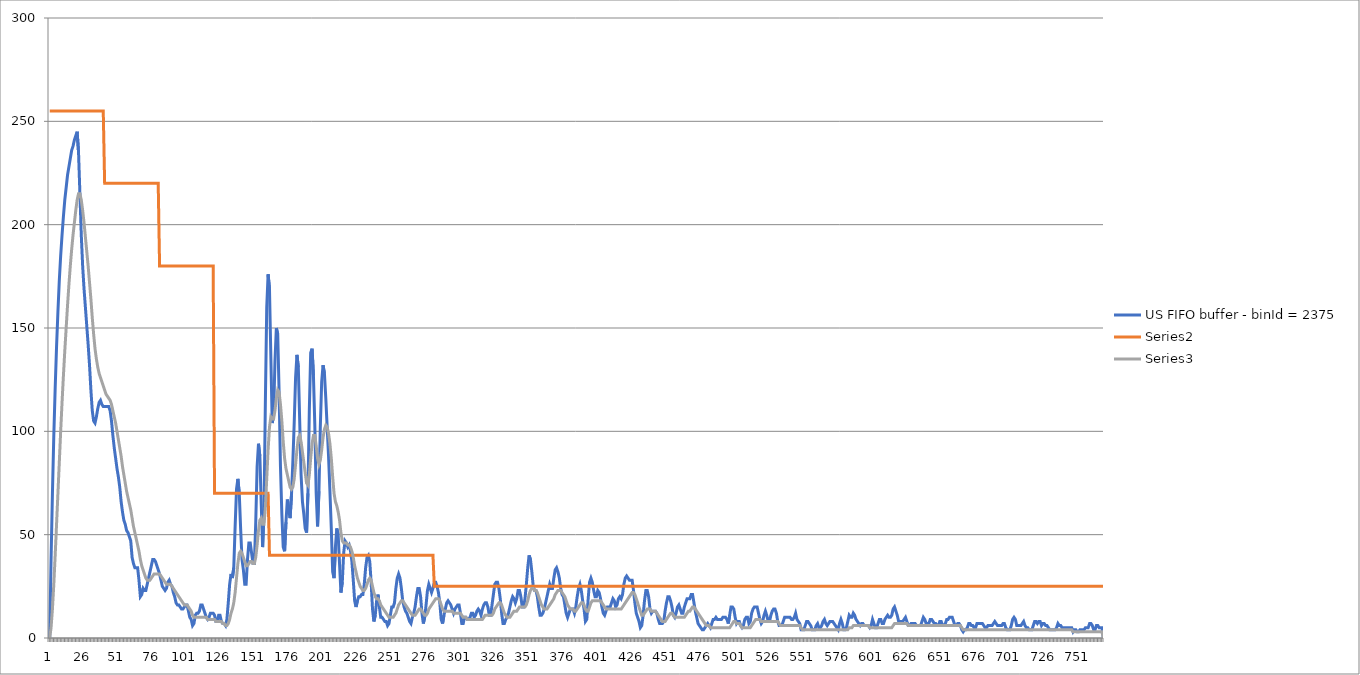
| Category | US FIFO buffer - binId = 2375 | Series 1 | Series 2 |
|---|---|---|---|
| 0 | 0 | 255 | 0 |
| 1 | 38 | 255 | 5 |
| 2 | 70 | 255 | 14 |
| 3 | 98 | 255 | 26 |
| 4 | 121 | 255 | 40 |
| 5 | 141 | 255 | 55 |
| 6 | 158 | 255 | 70 |
| 7 | 173 | 255 | 85 |
| 8 | 185 | 255 | 100 |
| 9 | 195 | 255 | 114 |
| 10 | 204 | 255 | 127 |
| 11 | 212 | 255 | 139 |
| 12 | 218 | 255 | 150 |
| 13 | 224 | 255 | 161 |
| 14 | 228 | 255 | 171 |
| 15 | 232 | 255 | 180 |
| 16 | 236 | 255 | 188 |
| 17 | 238 | 255 | 195 |
| 18 | 241 | 255 | 201 |
| 19 | 243 | 255 | 207 |
| 20 | 245 | 255 | 212 |
| 21 | 235 | 255 | 215 |
| 22 | 215 | 255 | 215 |
| 23 | 195 | 255 | 212 |
| 24 | 180 | 255 | 207 |
| 25 | 169 | 255 | 201 |
| 26 | 160 | 255 | 194 |
| 27 | 151 | 255 | 187 |
| 28 | 142 | 255 | 180 |
| 29 | 132 | 255 | 172 |
| 30 | 120 | 255 | 164 |
| 31 | 110 | 255 | 155 |
| 32 | 105 | 255 | 147 |
| 33 | 104 | 255 | 140 |
| 34 | 107 | 255 | 135 |
| 35 | 111 | 255 | 131 |
| 36 | 114 | 255 | 128 |
| 37 | 115 | 255 | 126 |
| 38 | 113 | 255 | 124 |
| 39 | 112 | 255 | 122 |
| 40 | 112 | 220 | 120 |
| 41 | 112 | 220 | 118 |
| 42 | 112 | 220 | 117 |
| 43 | 112 | 220 | 116 |
| 44 | 110 | 220 | 115 |
| 45 | 105 | 220 | 113 |
| 46 | 98 | 220 | 110 |
| 47 | 92 | 220 | 107 |
| 48 | 87 | 220 | 104 |
| 49 | 82 | 220 | 100 |
| 50 | 78 | 220 | 96 |
| 51 | 73 | 220 | 92 |
| 52 | 66 | 220 | 88 |
| 53 | 61 | 220 | 83 |
| 54 | 57 | 220 | 79 |
| 55 | 55 | 220 | 75 |
| 56 | 52 | 220 | 71 |
| 57 | 51 | 220 | 68 |
| 58 | 49 | 220 | 65 |
| 59 | 47 | 220 | 62 |
| 60 | 39 | 220 | 58 |
| 61 | 36 | 220 | 54 |
| 62 | 34 | 220 | 51 |
| 63 | 34 | 220 | 48 |
| 64 | 34 | 220 | 45 |
| 65 | 28 | 220 | 42 |
| 66 | 20 | 220 | 38 |
| 67 | 21 | 220 | 35 |
| 68 | 24 | 220 | 33 |
| 69 | 23 | 220 | 31 |
| 70 | 23 | 220 | 29 |
| 71 | 26 | 220 | 28 |
| 72 | 29 | 220 | 28 |
| 73 | 32 | 220 | 28 |
| 74 | 35 | 220 | 29 |
| 75 | 38 | 220 | 30 |
| 76 | 38 | 220 | 31 |
| 77 | 37 | 220 | 31 |
| 78 | 35 | 220 | 31 |
| 79 | 33 | 220 | 31 |
| 80 | 31 | 180 | 31 |
| 81 | 28 | 180 | 30 |
| 82 | 25 | 180 | 29 |
| 83 | 24 | 180 | 28 |
| 84 | 23 | 180 | 27 |
| 85 | 24 | 180 | 26 |
| 86 | 27 | 180 | 26 |
| 87 | 28 | 180 | 26 |
| 88 | 26 | 180 | 26 |
| 89 | 25 | 180 | 25 |
| 90 | 22 | 180 | 24 |
| 91 | 20 | 180 | 23 |
| 92 | 17 | 180 | 22 |
| 93 | 16 | 180 | 21 |
| 94 | 16 | 180 | 20 |
| 95 | 15 | 180 | 19 |
| 96 | 14 | 180 | 18 |
| 97 | 14 | 180 | 17 |
| 98 | 15 | 180 | 16 |
| 99 | 16 | 180 | 16 |
| 100 | 16 | 180 | 16 |
| 101 | 13 | 180 | 15 |
| 102 | 10 | 180 | 14 |
| 103 | 9 | 180 | 13 |
| 104 | 6 | 180 | 11 |
| 105 | 7 | 180 | 10 |
| 106 | 11 | 180 | 10 |
| 107 | 12 | 180 | 10 |
| 108 | 12 | 180 | 10 |
| 109 | 13 | 180 | 10 |
| 110 | 16 | 180 | 10 |
| 111 | 16 | 180 | 10 |
| 112 | 14 | 180 | 10 |
| 113 | 12 | 180 | 10 |
| 114 | 10 | 180 | 10 |
| 115 | 9 | 180 | 9 |
| 116 | 10 | 180 | 9 |
| 117 | 12 | 180 | 9 |
| 118 | 12 | 180 | 9 |
| 119 | 12 | 180 | 9 |
| 120 | 11 | 70 | 9 |
| 121 | 8 | 70 | 8 |
| 122 | 8 | 70 | 8 |
| 123 | 11 | 70 | 8 |
| 124 | 11 | 70 | 8 |
| 125 | 8 | 70 | 8 |
| 126 | 7 | 70 | 7 |
| 127 | 7 | 70 | 7 |
| 128 | 6 | 70 | 6 |
| 129 | 9 | 70 | 6 |
| 130 | 17 | 70 | 7 |
| 131 | 26 | 70 | 9 |
| 132 | 31 | 70 | 12 |
| 133 | 29 | 70 | 14 |
| 134 | 34 | 70 | 17 |
| 135 | 54 | 70 | 22 |
| 136 | 72 | 70 | 29 |
| 137 | 77 | 70 | 36 |
| 138 | 70 | 70 | 41 |
| 139 | 53 | 70 | 42 |
| 140 | 38 | 70 | 41 |
| 141 | 33 | 70 | 39 |
| 142 | 26 | 70 | 37 |
| 143 | 26 | 70 | 35 |
| 144 | 38 | 70 | 35 |
| 145 | 46 | 70 | 36 |
| 146 | 46 | 70 | 37 |
| 147 | 41 | 70 | 37 |
| 148 | 36 | 70 | 36 |
| 149 | 36 | 70 | 36 |
| 150 | 56 | 70 | 39 |
| 151 | 83 | 70 | 45 |
| 152 | 94 | 70 | 52 |
| 153 | 88 | 70 | 57 |
| 154 | 65 | 70 | 58 |
| 155 | 44 | 70 | 55 |
| 156 | 61 | 70 | 55 |
| 157 | 114 | 70 | 63 |
| 158 | 160 | 70 | 77 |
| 159 | 176 | 70 | 91 |
| 160 | 169 | 40 | 102 |
| 161 | 136 | 40 | 107 |
| 162 | 104 | 40 | 106 |
| 163 | 108 | 40 | 106 |
| 164 | 134 | 40 | 110 |
| 165 | 150 | 40 | 116 |
| 166 | 147 | 40 | 120 |
| 167 | 119 | 40 | 119 |
| 168 | 83 | 40 | 113 |
| 169 | 60 | 40 | 105 |
| 170 | 44 | 40 | 95 |
| 171 | 42 | 40 | 87 |
| 172 | 56 | 40 | 82 |
| 173 | 67 | 40 | 79 |
| 174 | 62 | 40 | 76 |
| 175 | 58 | 40 | 73 |
| 176 | 69 | 40 | 72 |
| 177 | 85 | 40 | 73 |
| 178 | 104 | 40 | 77 |
| 179 | 126 | 40 | 84 |
| 180 | 137 | 40 | 91 |
| 181 | 131 | 40 | 97 |
| 182 | 105 | 40 | 98 |
| 183 | 79 | 40 | 95 |
| 184 | 66 | 40 | 90 |
| 185 | 60 | 40 | 85 |
| 186 | 53 | 40 | 80 |
| 187 | 51 | 40 | 75 |
| 188 | 70 | 40 | 74 |
| 189 | 110 | 40 | 79 |
| 190 | 138 | 40 | 87 |
| 191 | 140 | 40 | 94 |
| 192 | 127 | 40 | 98 |
| 193 | 103 | 40 | 98 |
| 194 | 70 | 40 | 93 |
| 195 | 54 | 40 | 87 |
| 196 | 71 | 40 | 84 |
| 197 | 102 | 40 | 86 |
| 198 | 124 | 40 | 91 |
| 199 | 132 | 40 | 97 |
| 200 | 128 | 40 | 101 |
| 201 | 116 | 40 | 103 |
| 202 | 102 | 40 | 102 |
| 203 | 88 | 40 | 99 |
| 204 | 71 | 40 | 94 |
| 205 | 53 | 40 | 87 |
| 206 | 32 | 40 | 78 |
| 207 | 29 | 40 | 70 |
| 208 | 44 | 40 | 66 |
| 209 | 53 | 40 | 64 |
| 210 | 50 | 40 | 61 |
| 211 | 36 | 40 | 57 |
| 212 | 22 | 40 | 51 |
| 213 | 27 | 40 | 47 |
| 214 | 41 | 40 | 46 |
| 215 | 47 | 40 | 46 |
| 216 | 46 | 40 | 46 |
| 217 | 44 | 40 | 45 |
| 218 | 45 | 40 | 45 |
| 219 | 42 | 40 | 44 |
| 220 | 37 | 40 | 42 |
| 221 | 28 | 40 | 39 |
| 222 | 18 | 40 | 35 |
| 223 | 15 | 40 | 32 |
| 224 | 18 | 40 | 29 |
| 225 | 20 | 40 | 27 |
| 226 | 20 | 40 | 25 |
| 227 | 21 | 40 | 24 |
| 228 | 21 | 40 | 23 |
| 229 | 26 | 40 | 23 |
| 230 | 34 | 40 | 24 |
| 231 | 39 | 40 | 26 |
| 232 | 40 | 40 | 28 |
| 233 | 37 | 40 | 29 |
| 234 | 27 | 40 | 28 |
| 235 | 14 | 40 | 25 |
| 236 | 8 | 40 | 22 |
| 237 | 11 | 40 | 20 |
| 238 | 18 | 40 | 19 |
| 239 | 21 | 40 | 19 |
| 240 | 15 | 40 | 18 |
| 241 | 10 | 40 | 16 |
| 242 | 10 | 40 | 15 |
| 243 | 9 | 40 | 14 |
| 244 | 8 | 40 | 13 |
| 245 | 8 | 40 | 12 |
| 246 | 6 | 40 | 11 |
| 247 | 7 | 40 | 10 |
| 248 | 11 | 40 | 10 |
| 249 | 15 | 40 | 10 |
| 250 | 15 | 40 | 10 |
| 251 | 17 | 40 | 11 |
| 252 | 24 | 40 | 12 |
| 253 | 29 | 40 | 14 |
| 254 | 31 | 40 | 16 |
| 255 | 29 | 40 | 17 |
| 256 | 24 | 40 | 18 |
| 257 | 18 | 40 | 18 |
| 258 | 15 | 40 | 17 |
| 259 | 13 | 40 | 16 |
| 260 | 12 | 40 | 15 |
| 261 | 10 | 40 | 14 |
| 262 | 8 | 40 | 13 |
| 263 | 7 | 40 | 12 |
| 264 | 10 | 40 | 11 |
| 265 | 12 | 40 | 11 |
| 266 | 15 | 40 | 11 |
| 267 | 20 | 40 | 12 |
| 268 | 24 | 40 | 13 |
| 269 | 24 | 40 | 14 |
| 270 | 20 | 40 | 14 |
| 271 | 12 | 40 | 13 |
| 272 | 7 | 40 | 12 |
| 273 | 10 | 40 | 11 |
| 274 | 16 | 40 | 11 |
| 275 | 23 | 40 | 12 |
| 276 | 26 | 40 | 14 |
| 277 | 24 | 40 | 15 |
| 278 | 22 | 40 | 16 |
| 279 | 24 | 40 | 17 |
| 280 | 27 | 25 | 18 |
| 281 | 27 | 25 | 19 |
| 282 | 25 | 25 | 19 |
| 283 | 22 | 25 | 19 |
| 284 | 17 | 25 | 18 |
| 285 | 9 | 25 | 16 |
| 286 | 7 | 25 | 14 |
| 287 | 11 | 25 | 13 |
| 288 | 14 | 25 | 13 |
| 289 | 17 | 25 | 13 |
| 290 | 18 | 25 | 13 |
| 291 | 17 | 25 | 13 |
| 292 | 16 | 25 | 13 |
| 293 | 14 | 25 | 13 |
| 294 | 12 | 25 | 12 |
| 295 | 14 | 25 | 12 |
| 296 | 15 | 25 | 12 |
| 297 | 16 | 25 | 12 |
| 298 | 16 | 25 | 12 |
| 299 | 12 | 25 | 12 |
| 300 | 7 | 25 | 11 |
| 301 | 7 | 25 | 10 |
| 302 | 10 | 25 | 10 |
| 303 | 10 | 25 | 10 |
| 304 | 9 | 25 | 9 |
| 305 | 9 | 25 | 9 |
| 306 | 10 | 25 | 9 |
| 307 | 12 | 25 | 9 |
| 308 | 12 | 25 | 9 |
| 309 | 10 | 25 | 9 |
| 310 | 11 | 25 | 9 |
| 311 | 13 | 25 | 9 |
| 312 | 14 | 25 | 9 |
| 313 | 13 | 25 | 9 |
| 314 | 11 | 25 | 9 |
| 315 | 14 | 25 | 9 |
| 316 | 16 | 25 | 10 |
| 317 | 17 | 25 | 11 |
| 318 | 17 | 25 | 11 |
| 319 | 15 | 25 | 11 |
| 320 | 11 | 25 | 11 |
| 321 | 11 | 25 | 11 |
| 322 | 16 | 25 | 11 |
| 323 | 21 | 25 | 12 |
| 324 | 26 | 25 | 14 |
| 325 | 27 | 25 | 15 |
| 326 | 27 | 25 | 16 |
| 327 | 24 | 25 | 17 |
| 328 | 19 | 25 | 17 |
| 329 | 12 | 25 | 16 |
| 330 | 7 | 25 | 14 |
| 331 | 7 | 25 | 12 |
| 332 | 9 | 25 | 11 |
| 333 | 10 | 25 | 10 |
| 334 | 12 | 25 | 10 |
| 335 | 15 | 25 | 10 |
| 336 | 18 | 25 | 11 |
| 337 | 20 | 25 | 12 |
| 338 | 19 | 25 | 13 |
| 339 | 17 | 25 | 13 |
| 340 | 19 | 25 | 13 |
| 341 | 23 | 25 | 14 |
| 342 | 23 | 25 | 15 |
| 343 | 20 | 25 | 15 |
| 344 | 15 | 25 | 15 |
| 345 | 15 | 25 | 15 |
| 346 | 19 | 25 | 15 |
| 347 | 26 | 25 | 16 |
| 348 | 34 | 25 | 18 |
| 349 | 40 | 25 | 21 |
| 350 | 38 | 25 | 23 |
| 351 | 32 | 25 | 24 |
| 352 | 25 | 25 | 24 |
| 353 | 23 | 25 | 23 |
| 354 | 23 | 25 | 23 |
| 355 | 20 | 25 | 22 |
| 356 | 15 | 25 | 20 |
| 357 | 11 | 25 | 18 |
| 358 | 11 | 25 | 16 |
| 359 | 12 | 25 | 15 |
| 360 | 14 | 25 | 14 |
| 361 | 17 | 25 | 14 |
| 362 | 20 | 25 | 14 |
| 363 | 23 | 25 | 15 |
| 364 | 26 | 25 | 16 |
| 365 | 24 | 25 | 17 |
| 366 | 24 | 25 | 18 |
| 367 | 29 | 25 | 19 |
| 368 | 33 | 25 | 21 |
| 369 | 34 | 25 | 22 |
| 370 | 32 | 25 | 23 |
| 371 | 29 | 25 | 23 |
| 372 | 24 | 25 | 23 |
| 373 | 21 | 25 | 22 |
| 374 | 20 | 25 | 21 |
| 375 | 16 | 25 | 20 |
| 376 | 12 | 25 | 18 |
| 377 | 10 | 25 | 16 |
| 378 | 12 | 25 | 15 |
| 379 | 14 | 25 | 14 |
| 380 | 14 | 25 | 14 |
| 381 | 14 | 25 | 14 |
| 382 | 12 | 25 | 13 |
| 383 | 15 | 25 | 13 |
| 384 | 20 | 25 | 14 |
| 385 | 24 | 25 | 15 |
| 386 | 26 | 25 | 16 |
| 387 | 23 | 25 | 17 |
| 388 | 18 | 25 | 17 |
| 389 | 14 | 25 | 16 |
| 390 | 8 | 25 | 14 |
| 391 | 9 | 25 | 13 |
| 392 | 19 | 25 | 13 |
| 393 | 27 | 25 | 15 |
| 394 | 29 | 25 | 17 |
| 395 | 27 | 25 | 18 |
| 396 | 23 | 25 | 18 |
| 397 | 20 | 25 | 18 |
| 398 | 20 | 25 | 18 |
| 399 | 23 | 25 | 18 |
| 400 | 22 | 25 | 18 |
| 401 | 19 | 25 | 18 |
| 402 | 15 | 25 | 17 |
| 403 | 12 | 25 | 16 |
| 404 | 11 | 25 | 15 |
| 405 | 13 | 25 | 14 |
| 406 | 15 | 25 | 14 |
| 407 | 15 | 25 | 14 |
| 408 | 15 | 25 | 14 |
| 409 | 17 | 25 | 14 |
| 410 | 19 | 25 | 14 |
| 411 | 18 | 25 | 14 |
| 412 | 15 | 25 | 14 |
| 413 | 16 | 25 | 14 |
| 414 | 19 | 25 | 14 |
| 415 | 20 | 25 | 14 |
| 416 | 19 | 25 | 14 |
| 417 | 21 | 25 | 15 |
| 418 | 26 | 25 | 16 |
| 419 | 29 | 25 | 17 |
| 420 | 30 | 25 | 18 |
| 421 | 29 | 25 | 19 |
| 422 | 28 | 25 | 20 |
| 423 | 28 | 25 | 21 |
| 424 | 28 | 25 | 22 |
| 425 | 23 | 25 | 22 |
| 426 | 17 | 25 | 21 |
| 427 | 12 | 25 | 19 |
| 428 | 10 | 25 | 17 |
| 429 | 8 | 25 | 15 |
| 430 | 5 | 25 | 13 |
| 431 | 6 | 25 | 11 |
| 432 | 11 | 25 | 11 |
| 433 | 18 | 25 | 12 |
| 434 | 23 | 25 | 13 |
| 435 | 23 | 25 | 14 |
| 436 | 20 | 25 | 14 |
| 437 | 14 | 25 | 14 |
| 438 | 12 | 25 | 13 |
| 439 | 13 | 25 | 13 |
| 440 | 13 | 25 | 13 |
| 441 | 13 | 25 | 13 |
| 442 | 12 | 25 | 12 |
| 443 | 9 | 25 | 11 |
| 444 | 7 | 25 | 10 |
| 445 | 7 | 25 | 9 |
| 446 | 7 | 25 | 8 |
| 447 | 8 | 25 | 8 |
| 448 | 13 | 25 | 8 |
| 449 | 17 | 25 | 9 |
| 450 | 20 | 25 | 10 |
| 451 | 20 | 25 | 11 |
| 452 | 18 | 25 | 12 |
| 453 | 15 | 25 | 12 |
| 454 | 11 | 25 | 11 |
| 455 | 10 | 25 | 10 |
| 456 | 12 | 25 | 10 |
| 457 | 15 | 25 | 10 |
| 458 | 16 | 25 | 10 |
| 459 | 14 | 25 | 10 |
| 460 | 12 | 25 | 10 |
| 461 | 12 | 25 | 10 |
| 462 | 15 | 25 | 10 |
| 463 | 17 | 25 | 11 |
| 464 | 19 | 25 | 12 |
| 465 | 19 | 25 | 13 |
| 466 | 19 | 25 | 13 |
| 467 | 21 | 25 | 14 |
| 468 | 21 | 25 | 15 |
| 469 | 17 | 25 | 15 |
| 470 | 13 | 25 | 14 |
| 471 | 10 | 25 | 13 |
| 472 | 7 | 25 | 12 |
| 473 | 6 | 25 | 11 |
| 474 | 5 | 25 | 10 |
| 475 | 4 | 25 | 9 |
| 476 | 4 | 25 | 8 |
| 477 | 5 | 25 | 7 |
| 478 | 6 | 25 | 6 |
| 479 | 7 | 25 | 6 |
| 480 | 6 | 25 | 6 |
| 481 | 5 | 25 | 5 |
| 482 | 7 | 25 | 5 |
| 483 | 9 | 25 | 5 |
| 484 | 9 | 25 | 5 |
| 485 | 10 | 25 | 5 |
| 486 | 9 | 25 | 5 |
| 487 | 9 | 25 | 5 |
| 488 | 9 | 25 | 5 |
| 489 | 9 | 25 | 5 |
| 490 | 10 | 25 | 5 |
| 491 | 10 | 25 | 5 |
| 492 | 10 | 25 | 5 |
| 493 | 9 | 25 | 5 |
| 494 | 7 | 25 | 5 |
| 495 | 11 | 25 | 5 |
| 496 | 15 | 25 | 6 |
| 497 | 15 | 25 | 7 |
| 498 | 14 | 25 | 8 |
| 499 | 10 | 25 | 8 |
| 500 | 7 | 25 | 7 |
| 501 | 8 | 25 | 7 |
| 502 | 8 | 25 | 7 |
| 503 | 6 | 25 | 6 |
| 504 | 5 | 25 | 5 |
| 505 | 6 | 25 | 5 |
| 506 | 9 | 25 | 5 |
| 507 | 10 | 25 | 5 |
| 508 | 10 | 25 | 5 |
| 509 | 7 | 25 | 5 |
| 510 | 8 | 25 | 5 |
| 511 | 12 | 25 | 6 |
| 512 | 14 | 25 | 7 |
| 513 | 15 | 25 | 8 |
| 514 | 15 | 25 | 9 |
| 515 | 15 | 25 | 9 |
| 516 | 12 | 25 | 9 |
| 517 | 9 | 25 | 9 |
| 518 | 7 | 25 | 8 |
| 519 | 8 | 25 | 8 |
| 520 | 11 | 25 | 8 |
| 521 | 13 | 25 | 8 |
| 522 | 11 | 25 | 8 |
| 523 | 8 | 25 | 8 |
| 524 | 8 | 25 | 8 |
| 525 | 11 | 25 | 8 |
| 526 | 13 | 25 | 8 |
| 527 | 14 | 25 | 8 |
| 528 | 14 | 25 | 8 |
| 529 | 12 | 25 | 8 |
| 530 | 8 | 25 | 8 |
| 531 | 6 | 25 | 7 |
| 532 | 6 | 25 | 6 |
| 533 | 6 | 25 | 6 |
| 534 | 8 | 25 | 6 |
| 535 | 10 | 25 | 6 |
| 536 | 10 | 25 | 6 |
| 537 | 10 | 25 | 6 |
| 538 | 10 | 25 | 6 |
| 539 | 10 | 25 | 6 |
| 540 | 9 | 25 | 6 |
| 541 | 9 | 25 | 6 |
| 542 | 10 | 25 | 6 |
| 543 | 12 | 25 | 6 |
| 544 | 9 | 25 | 6 |
| 545 | 8 | 25 | 6 |
| 546 | 7 | 25 | 6 |
| 547 | 4 | 25 | 5 |
| 548 | 4 | 25 | 4 |
| 549 | 4 | 25 | 4 |
| 550 | 6 | 25 | 4 |
| 551 | 8 | 25 | 4 |
| 552 | 8 | 25 | 4 |
| 553 | 7 | 25 | 4 |
| 554 | 6 | 25 | 4 |
| 555 | 4 | 25 | 4 |
| 556 | 4 | 25 | 4 |
| 557 | 4 | 25 | 4 |
| 558 | 6 | 25 | 4 |
| 559 | 7 | 25 | 4 |
| 560 | 5 | 25 | 4 |
| 561 | 5 | 25 | 4 |
| 562 | 6 | 25 | 4 |
| 563 | 8 | 25 | 4 |
| 564 | 9 | 25 | 4 |
| 565 | 7 | 25 | 4 |
| 566 | 6 | 25 | 4 |
| 567 | 7 | 25 | 4 |
| 568 | 8 | 25 | 4 |
| 569 | 8 | 25 | 4 |
| 570 | 8 | 25 | 4 |
| 571 | 7 | 25 | 4 |
| 572 | 6 | 25 | 4 |
| 573 | 5 | 25 | 4 |
| 574 | 4 | 25 | 4 |
| 575 | 7 | 25 | 4 |
| 576 | 9 | 25 | 4 |
| 577 | 7 | 25 | 4 |
| 578 | 4 | 25 | 4 |
| 579 | 4 | 25 | 4 |
| 580 | 5 | 25 | 4 |
| 581 | 8 | 25 | 4 |
| 582 | 11 | 25 | 5 |
| 583 | 10 | 25 | 5 |
| 584 | 10 | 25 | 5 |
| 585 | 12 | 25 | 6 |
| 586 | 11 | 25 | 6 |
| 587 | 9 | 25 | 6 |
| 588 | 8 | 25 | 6 |
| 589 | 7 | 25 | 6 |
| 590 | 6 | 25 | 6 |
| 591 | 7 | 25 | 6 |
| 592 | 7 | 25 | 6 |
| 593 | 6 | 25 | 6 |
| 594 | 6 | 25 | 6 |
| 595 | 6 | 25 | 6 |
| 596 | 6 | 25 | 6 |
| 597 | 5 | 25 | 5 |
| 598 | 6 | 25 | 5 |
| 599 | 9 | 25 | 5 |
| 600 | 7 | 25 | 5 |
| 601 | 5 | 25 | 5 |
| 602 | 5 | 25 | 5 |
| 603 | 7 | 25 | 5 |
| 604 | 9 | 25 | 5 |
| 605 | 9 | 25 | 5 |
| 606 | 7 | 25 | 5 |
| 607 | 7 | 25 | 5 |
| 608 | 9 | 25 | 5 |
| 609 | 10 | 25 | 5 |
| 610 | 11 | 25 | 5 |
| 611 | 10 | 25 | 5 |
| 612 | 10 | 25 | 5 |
| 613 | 11 | 25 | 5 |
| 614 | 14 | 25 | 6 |
| 615 | 15 | 25 | 7 |
| 616 | 13 | 25 | 7 |
| 617 | 11 | 25 | 7 |
| 618 | 8 | 25 | 7 |
| 619 | 8 | 25 | 7 |
| 620 | 8 | 25 | 7 |
| 621 | 8 | 25 | 7 |
| 622 | 9 | 25 | 7 |
| 623 | 10 | 25 | 7 |
| 624 | 8 | 25 | 7 |
| 625 | 6 | 25 | 6 |
| 626 | 6 | 25 | 6 |
| 627 | 7 | 25 | 6 |
| 628 | 7 | 25 | 6 |
| 629 | 7 | 25 | 6 |
| 630 | 7 | 25 | 6 |
| 631 | 6 | 25 | 6 |
| 632 | 6 | 25 | 6 |
| 633 | 6 | 25 | 6 |
| 634 | 6 | 25 | 6 |
| 635 | 8 | 25 | 6 |
| 636 | 10 | 25 | 6 |
| 637 | 9 | 25 | 6 |
| 638 | 7 | 25 | 6 |
| 639 | 7 | 25 | 6 |
| 640 | 7 | 25 | 6 |
| 641 | 9 | 25 | 6 |
| 642 | 9 | 25 | 6 |
| 643 | 8 | 25 | 6 |
| 644 | 7 | 25 | 6 |
| 645 | 7 | 25 | 6 |
| 646 | 6 | 25 | 6 |
| 647 | 6 | 25 | 6 |
| 648 | 8 | 25 | 6 |
| 649 | 8 | 25 | 6 |
| 650 | 6 | 25 | 6 |
| 651 | 6 | 25 | 6 |
| 652 | 7 | 25 | 6 |
| 653 | 9 | 25 | 6 |
| 654 | 9 | 25 | 6 |
| 655 | 10 | 25 | 6 |
| 656 | 10 | 25 | 6 |
| 657 | 10 | 25 | 6 |
| 658 | 8 | 25 | 6 |
| 659 | 6 | 25 | 6 |
| 660 | 6 | 25 | 6 |
| 661 | 7 | 25 | 6 |
| 662 | 7 | 25 | 6 |
| 663 | 6 | 25 | 6 |
| 664 | 4 | 25 | 5 |
| 665 | 3 | 25 | 4 |
| 666 | 4 | 25 | 4 |
| 667 | 4 | 25 | 4 |
| 668 | 5 | 25 | 4 |
| 669 | 7 | 25 | 4 |
| 670 | 7 | 25 | 4 |
| 671 | 6 | 25 | 4 |
| 672 | 6 | 25 | 4 |
| 673 | 5 | 25 | 4 |
| 674 | 5 | 25 | 4 |
| 675 | 7 | 25 | 4 |
| 676 | 7 | 25 | 4 |
| 677 | 7 | 25 | 4 |
| 678 | 7 | 25 | 4 |
| 679 | 7 | 25 | 4 |
| 680 | 6 | 25 | 4 |
| 681 | 5 | 25 | 4 |
| 682 | 5 | 25 | 4 |
| 683 | 6 | 25 | 4 |
| 684 | 6 | 25 | 4 |
| 685 | 6 | 25 | 4 |
| 686 | 6 | 25 | 4 |
| 687 | 7 | 25 | 4 |
| 688 | 8 | 25 | 4 |
| 689 | 7 | 25 | 4 |
| 690 | 6 | 25 | 4 |
| 691 | 6 | 25 | 4 |
| 692 | 6 | 25 | 4 |
| 693 | 6 | 25 | 4 |
| 694 | 7 | 25 | 4 |
| 695 | 7 | 25 | 4 |
| 696 | 5 | 25 | 4 |
| 697 | 4 | 25 | 4 |
| 698 | 4 | 25 | 4 |
| 699 | 4 | 25 | 4 |
| 700 | 6 | 25 | 4 |
| 701 | 9 | 25 | 4 |
| 702 | 10 | 25 | 4 |
| 703 | 9 | 25 | 4 |
| 704 | 6 | 25 | 4 |
| 705 | 6 | 25 | 4 |
| 706 | 6 | 25 | 4 |
| 707 | 6 | 25 | 4 |
| 708 | 7 | 25 | 4 |
| 709 | 8 | 25 | 4 |
| 710 | 6 | 25 | 4 |
| 711 | 5 | 25 | 4 |
| 712 | 5 | 25 | 4 |
| 713 | 4 | 25 | 4 |
| 714 | 4 | 25 | 4 |
| 715 | 4 | 25 | 4 |
| 716 | 6 | 25 | 4 |
| 717 | 8 | 25 | 4 |
| 718 | 8 | 25 | 4 |
| 719 | 7 | 25 | 4 |
| 720 | 8 | 25 | 4 |
| 721 | 8 | 25 | 4 |
| 722 | 6 | 25 | 4 |
| 723 | 7 | 25 | 4 |
| 724 | 7 | 25 | 4 |
| 725 | 6 | 25 | 4 |
| 726 | 6 | 25 | 4 |
| 727 | 5 | 25 | 4 |
| 728 | 4 | 25 | 4 |
| 729 | 4 | 25 | 4 |
| 730 | 4 | 25 | 4 |
| 731 | 4 | 25 | 4 |
| 732 | 4 | 25 | 4 |
| 733 | 5 | 25 | 4 |
| 734 | 7 | 25 | 4 |
| 735 | 6 | 25 | 4 |
| 736 | 6 | 25 | 4 |
| 737 | 5 | 25 | 4 |
| 738 | 5 | 25 | 4 |
| 739 | 5 | 25 | 4 |
| 740 | 5 | 25 | 4 |
| 741 | 5 | 25 | 4 |
| 742 | 5 | 25 | 4 |
| 743 | 5 | 25 | 4 |
| 744 | 5 | 25 | 4 |
| 745 | 3 | 25 | 3 |
| 746 | 4 | 25 | 3 |
| 747 | 4 | 25 | 3 |
| 748 | 3 | 25 | 3 |
| 749 | 3 | 25 | 3 |
| 750 | 4 | 25 | 3 |
| 751 | 4 | 25 | 3 |
| 752 | 4 | 25 | 3 |
| 753 | 4 | 25 | 3 |
| 754 | 5 | 25 | 3 |
| 755 | 5 | 25 | 3 |
| 756 | 5 | 25 | 3 |
| 757 | 7 | 25 | 3 |
| 758 | 7 | 25 | 3 |
| 759 | 6 | 25 | 3 |
| 760 | 4 | 25 | 3 |
| 761 | 4 | 25 | 3 |
| 762 | 6 | 25 | 3 |
| 763 | 6 | 25 | 3 |
| 764 | 5 | 25 | 3 |
| 765 | 5 | 25 | 3 |
| 766 | 5 | 25 | 3 |
| 767 | 0 | 25 | 0 |